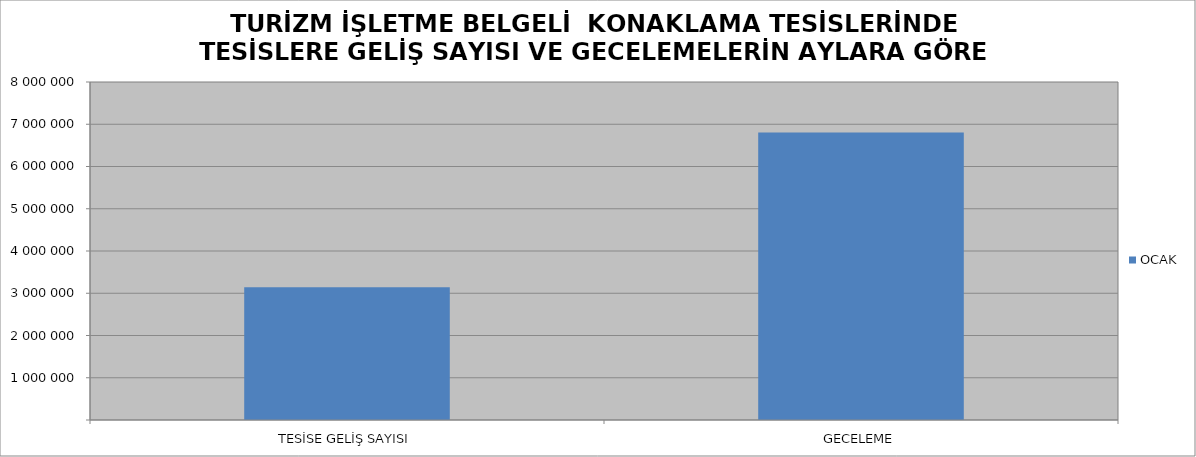
| Category | OCAK |
|---|---|
| TESİSE GELİŞ SAYISI | 3140857 |
| GECELEME | 6806196 |